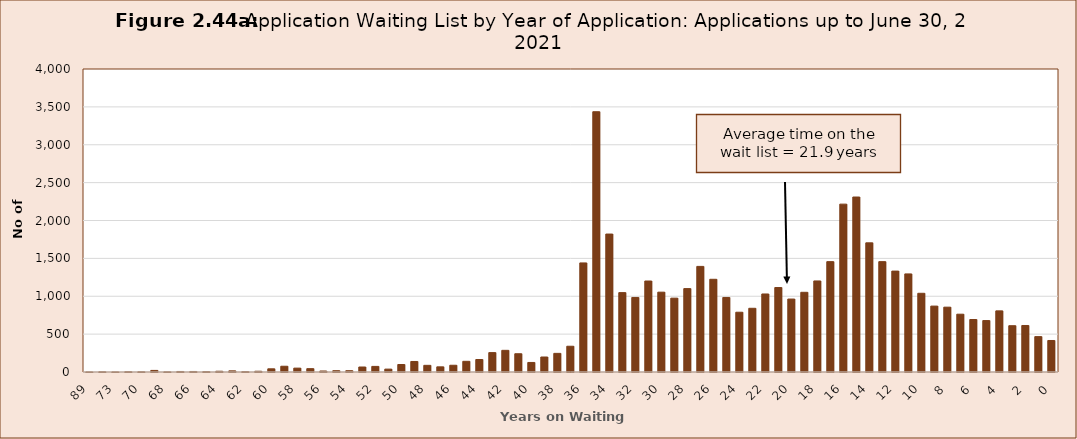
| Category | Series 0 |
|---|---|
| 89.0 | 1 |
| 74.0 | 3 |
| 73.0 | 1 |
| 71.0 | 4 |
| 70.0 | 3 |
| 69.0 | 21 |
| 68.0 | 2 |
| 67.0 | 7 |
| 66.0 | 7 |
| 65.0 | 5 |
| 64.0 | 10 |
| 63.0 | 15 |
| 62.0 | 5 |
| 61.0 | 10 |
| 60.0 | 42 |
| 59.0 | 76 |
| 58.0 | 51 |
| 57.0 | 44 |
| 56.0 | 13 |
| 55.0 | 17 |
| 54.0 | 17 |
| 53.0 | 66 |
| 52.0 | 74 |
| 51.0 | 38 |
| 50.0 | 99 |
| 49.0 | 139 |
| 48.0 | 88 |
| 47.0 | 68 |
| 46.0 | 89 |
| 45.0 | 141 |
| 44.0 | 165 |
| 43.0 | 256 |
| 42.0 | 286 |
| 41.0 | 241 |
| 40.0 | 126 |
| 39.0 | 198 |
| 38.0 | 246 |
| 37.0 | 340 |
| 36.0 | 1440 |
| 35.0 | 3436 |
| 34.0 | 1821 |
| 33.0 | 1048 |
| 32.0 | 984 |
| 31.0 | 1201 |
| 30.0 | 1054 |
| 29.0 | 975 |
| 28.0 | 1101 |
| 27.0 | 1394 |
| 26.0 | 1224 |
| 25.0 | 984 |
| 24.0 | 789 |
| 23.0 | 841 |
| 22.0 | 1030 |
| 21.0 | 1115 |
| 20.0 | 963 |
| 19.0 | 1052 |
| 18.0 | 1202 |
| 17.0 | 1457 |
| 16.0 | 2216 |
| 15.0 | 2310 |
| 14.0 | 1705 |
| 13.0 | 1457 |
| 12.0 | 1332 |
| 11.0 | 1295 |
| 10.0 | 1039 |
| 9.0 | 870 |
| 8.0 | 856 |
| 7.0 | 763 |
| 6.0 | 693 |
| 5.0 | 679 |
| 4.0 | 807 |
| 3.0 | 611 |
| 2.0 | 614 |
| 1.0 | 467 |
| 0.0 | 416 |